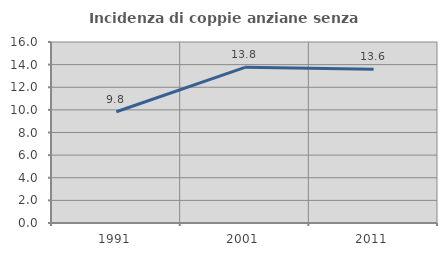
| Category | Incidenza di coppie anziane senza figli  |
|---|---|
| 1991.0 | 9.836 |
| 2001.0 | 13.761 |
| 2011.0 | 13.602 |